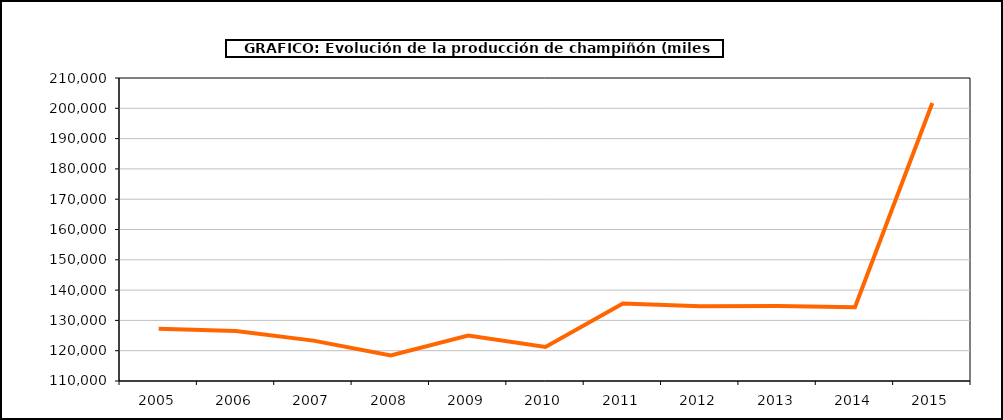
| Category | producción |
|---|---|
| 2005.0 | 127213 |
| 2006.0 | 126463 |
| 2007.0 | 123322 |
| 2008.0 | 118398 |
| 2009.0 | 125017 |
| 2010.0 | 121248 |
| 2011.0 | 135545 |
| 2012.0 | 134676 |
| 2013.0 | 134768 |
| 2014.0 | 134317 |
| 2015.0 | 201740 |